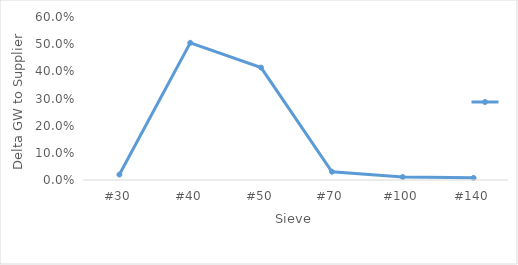
| Category | Series 0 |
|---|---|
| #30 | 0.02 |
| #40 | 0.505 |
| #50 | 0.414 |
| #70 | 0.03 |
| #100 | 0.011 |
| #140 | 0.008 |